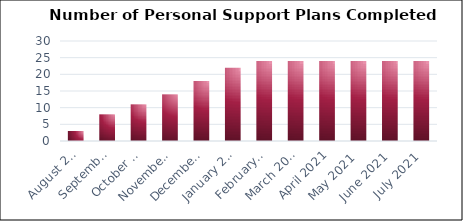
| Category | Number of PSP's Completed (cumulative) |
|---|---|
| August 2020 | 3 |
| September 2020 | 8 |
| October 2020 | 11 |
| November 2020 | 14 |
| December 2020 | 18 |
| January 2021 | 22 |
| February 2021 | 24 |
| March 2021 | 24 |
| April 2021 | 24 |
| May 2021 | 24 |
| June 2021 | 24 |
| July 2021 | 24 |